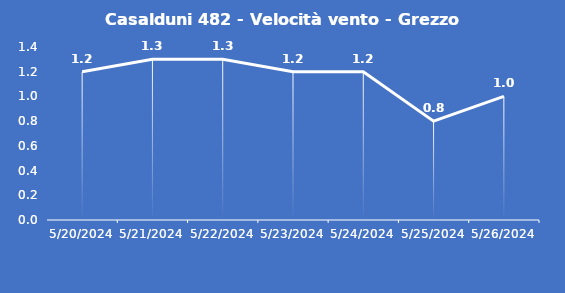
| Category | Casalduni 482 - Velocità vento - Grezzo (m/s) |
|---|---|
| 5/20/24 | 1.2 |
| 5/21/24 | 1.3 |
| 5/22/24 | 1.3 |
| 5/23/24 | 1.2 |
| 5/24/24 | 1.2 |
| 5/25/24 | 0.8 |
| 5/26/24 | 1 |